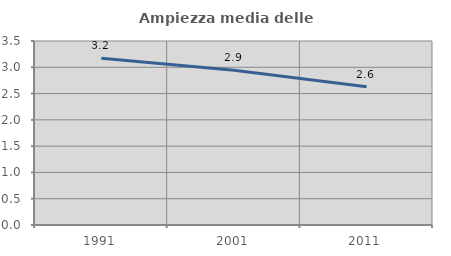
| Category | Ampiezza media delle famiglie |
|---|---|
| 1991.0 | 3.173 |
| 2001.0 | 2.942 |
| 2011.0 | 2.632 |